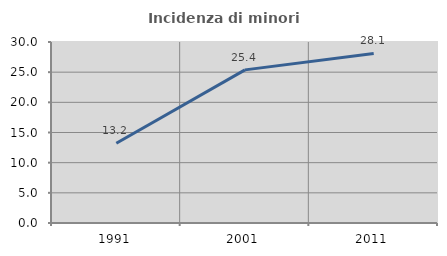
| Category | Incidenza di minori stranieri |
|---|---|
| 1991.0 | 13.223 |
| 2001.0 | 25.379 |
| 2011.0 | 28.109 |